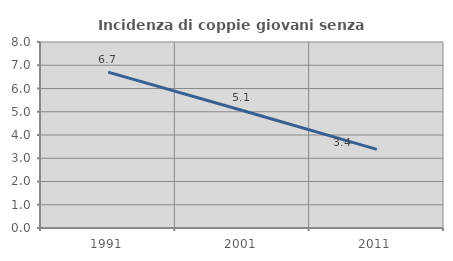
| Category | Incidenza di coppie giovani senza figli |
|---|---|
| 1991.0 | 6.702 |
| 2001.0 | 5.055 |
| 2011.0 | 3.384 |